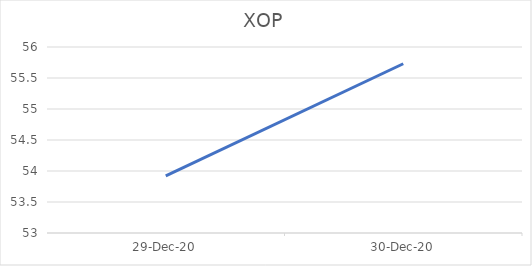
| Category | Series 0 |
|---|---|
| 2020-12-29 | 53.92 |
| 2020-12-30 | 55.73 |